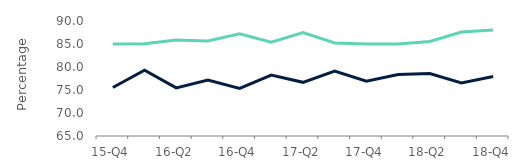
| Category | First-time
buyers | Homemovers |
|---|---|---|
| 15-Q4 | 85 | 75.54 |
| 16-Q1 | 85.04 | 79.29 |
| 16-Q2 | 85.85 | 75.46 |
| 16-Q3 | 85.64 | 77.17 |
| 16-Q4 | 87.21 | 75.36 |
| 17-Q1 | 85.385 | 78.24 |
| 17-Q2 | 87.5 | 76.67 |
| 17-Q3 | 85.23 | 79.12 |
| 17-Q4 | 85 | 76.92 |
| 18-Q1 | 85 | 78.36 |
| 18-Q2 | 85.54 | 78.6 |
| 18-Q3 | 87.62 | 76.545 |
| 18-Q4 | 88.06 | 77.93 |